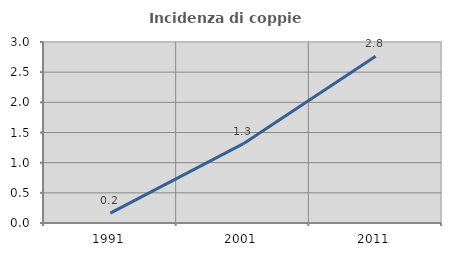
| Category | Incidenza di coppie miste |
|---|---|
| 1991.0 | 0.164 |
| 2001.0 | 1.311 |
| 2011.0 | 2.762 |